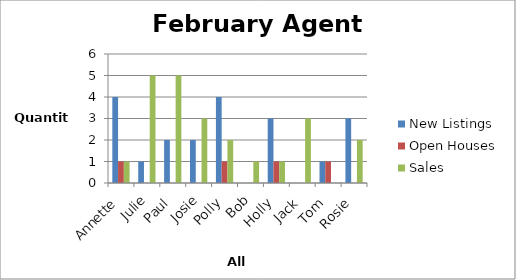
| Category | New Listings | Open Houses | Sales |
|---|---|---|---|
| Annette | 4 | 1 | 1 |
| Julie | 1 | 0 | 5 |
| Paul | 2 | 0 | 5 |
| Josie | 2 | 0 | 3 |
| Polly | 4 | 1 | 2 |
| Bob | 0 | 0 | 1 |
| Holly | 3 | 1 | 1 |
| Jack | 0 | 0 | 3 |
| Tom | 1 | 1 | 0 |
| Rosie | 3 | 0 | 2 |